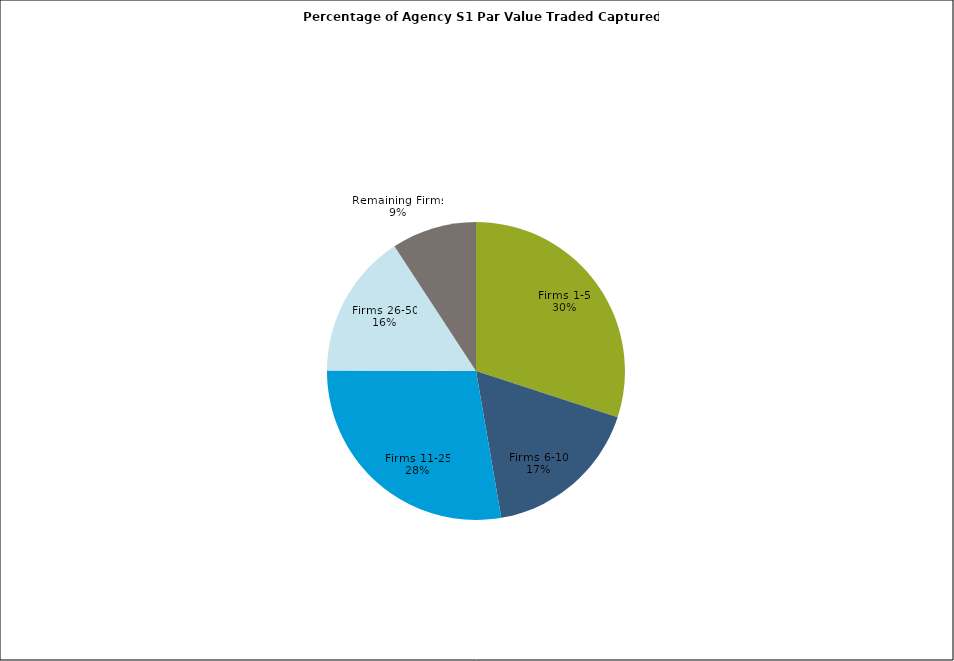
| Category | Series 0 |
|---|---|
| Firms 1-5 | 0.3 |
| Firms 6-10 | 0.173 |
| Firms 11-25 | 0.278 |
| Firms 26-50 | 0.157 |
| Remaining Firms | 0.092 |